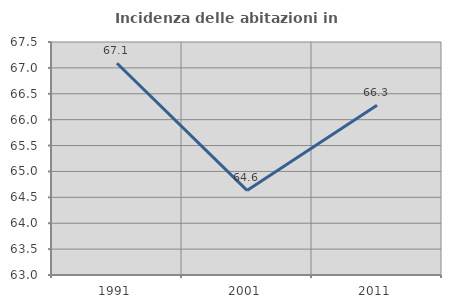
| Category | Incidenza delle abitazioni in proprietà  |
|---|---|
| 1991.0 | 67.089 |
| 2001.0 | 64.634 |
| 2011.0 | 66.279 |